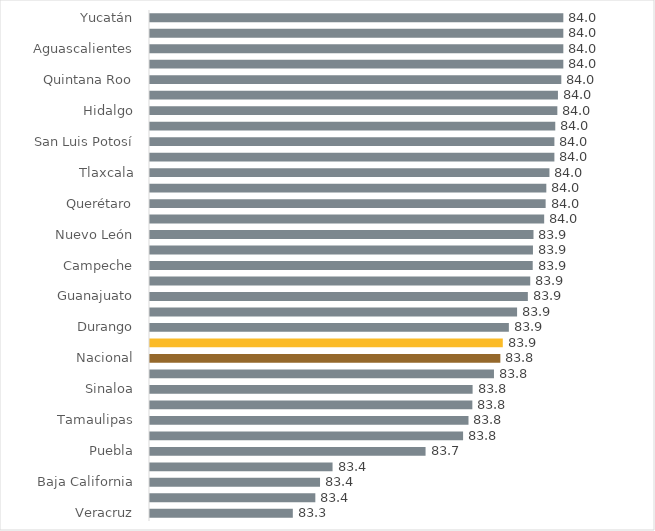
| Category | Series 0 |
|---|---|
| Veracruz | 83.346 |
| Nayarit | 83.4 |
| Baja California | 83.411 |
| Colima | 83.442 |
| Puebla | 83.667 |
| Coahuila | 83.757 |
| Tamaulipas | 83.771 |
| Tabasco | 83.78 |
| Sinaloa | 83.78 |
| Michoacán | 83.832 |
| Nacional | 83.848 |
| Jalisco | 83.854 |
| Durango | 83.868 |
| Chihuahua | 83.888 |
| Guanajuato | 83.914 |
| Ciudad de México | 83.92 |
| Campeche | 83.926 |
| Estado de México | 83.927 |
| Nuevo León | 83.928 |
| Guerrero | 83.954 |
| Querétaro | 83.957 |
| Sonora | 83.959 |
| Tlaxcala | 83.966 |
| Oaxaca | 83.978 |
| San Luis Potosí | 83.978 |
| Zacatecas | 83.98 |
| Hidalgo | 83.986 |
| Chiapas | 83.987 |
| Quintana Roo | 83.995 |
| Morelos | 84 |
| Aguascalientes | 84 |
| Baja California Sur | 84 |
| Yucatán | 84 |